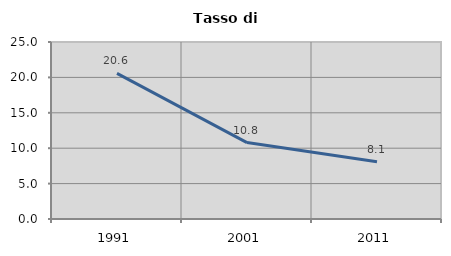
| Category | Tasso di disoccupazione   |
|---|---|
| 1991.0 | 20.568 |
| 2001.0 | 10.793 |
| 2011.0 | 8.096 |